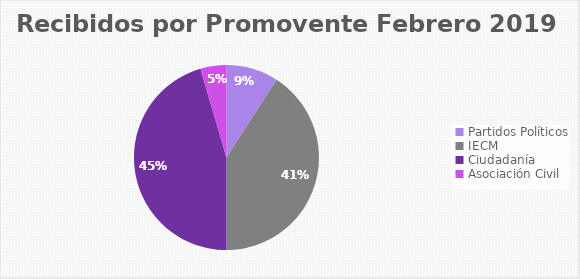
| Category | Recibidos por Promovente FEBRERO |
|---|---|
| Partidos Políticos | 2 |
| IECM | 9 |
| Ciudadanía  | 10 |
| Asociación Civil | 1 |